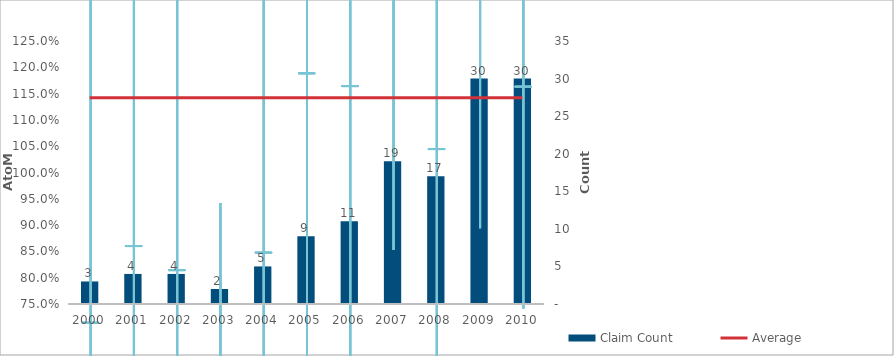
| Category | Claim Count |
|---|---|
| 0 | 3 |
| 1 | 4 |
| 2 | 4 |
| 3 | 2 |
| 4 | 5 |
| 5 | 9 |
| 6 | 11 |
| 7 | 19 |
| 8 | 17 |
| 9 | 30 |
| 10 | 30 |